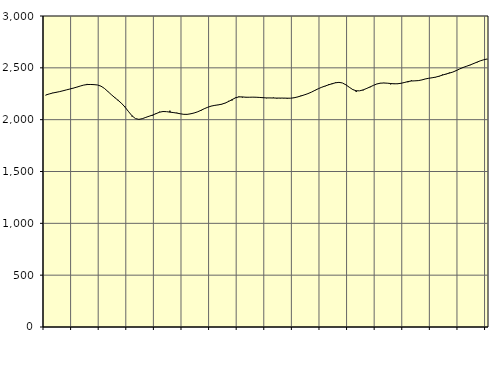
| Category | Piggar | Series 1 |
|---|---|---|
| nan | 2235.2 | 2238.07 |
| 87.0 | 2248 | 2247.77 |
| 87.0 | 2258.7 | 2256.79 |
| 87.0 | 2261.1 | 2263.73 |
| nan | 2269.2 | 2270.29 |
| 88.0 | 2278.3 | 2278.61 |
| 88.0 | 2286.8 | 2287.31 |
| 88.0 | 2295.1 | 2295.56 |
| nan | 2302.8 | 2304.44 |
| 89.0 | 2315.4 | 2313.88 |
| 89.0 | 2324.6 | 2324.27 |
| 89.0 | 2334.2 | 2333.53 |
| nan | 2344.9 | 2338.76 |
| 90.0 | 2336.5 | 2339.51 |
| 90.0 | 2337.7 | 2338.01 |
| 90.0 | 2334.8 | 2334.57 |
| nan | 2324.6 | 2323.56 |
| 91.0 | 2302.7 | 2301.9 |
| 91.0 | 2269.9 | 2272.43 |
| 91.0 | 2240.9 | 2241.71 |
| nan | 2208.5 | 2213.39 |
| 92.0 | 2190.7 | 2186.06 |
| 92.0 | 2154.6 | 2156.76 |
| 92.0 | 2125.3 | 2120.67 |
| nan | 2079.9 | 2078.05 |
| 93.0 | 2031 | 2037.69 |
| 93.0 | 2010.7 | 2010.76 |
| 93.0 | 2003.6 | 2002.97 |
| nan | 2011.4 | 2009.57 |
| 94.0 | 2024.1 | 2021.88 |
| 94.0 | 2034.2 | 2033.52 |
| 94.0 | 2039.3 | 2044.78 |
| nan | 2054.3 | 2058.54 |
| 95.0 | 2076.3 | 2071.97 |
| 95.0 | 2078.9 | 2078.75 |
| 95.0 | 2077.3 | 2077.29 |
| nan | 2086.9 | 2072.66 |
| 96.0 | 2065.4 | 2068.48 |
| 96.0 | 2067 | 2063.51 |
| 96.0 | 2057.8 | 2056.82 |
| nan | 2049.8 | 2051.5 |
| 97.0 | 2049.3 | 2051.26 |
| 97.0 | 2058.5 | 2056.44 |
| 97.0 | 2064.6 | 2064.35 |
| nan | 2074.3 | 2075.24 |
| 98.0 | 2085 | 2090.03 |
| 98.0 | 2108 | 2106.24 |
| 98.0 | 2119.9 | 2119.99 |
| nan | 2132.3 | 2130.99 |
| 99.0 | 2140.6 | 2137.99 |
| 99.0 | 2140.8 | 2142.72 |
| 99.0 | 2146.2 | 2149.23 |
| nan | 2158.8 | 2160.11 |
| 0.0 | 2181.5 | 2175.11 |
| 0.0 | 2184.5 | 2193.18 |
| 0.0 | 2213.5 | 2210.47 |
| nan | 2224 | 2219.69 |
| 1.0 | 2213.5 | 2219.41 |
| 1.0 | 2219 | 2216.24 |
| 1.0 | 2216.7 | 2216.34 |
| nan | 2218.3 | 2217.19 |
| 2.0 | 2217.2 | 2216.32 |
| 2.0 | 2212.2 | 2214.56 |
| 2.0 | 2214.5 | 2211.74 |
| nan | 2206.9 | 2209.84 |
| 3.0 | 2210.1 | 2209.61 |
| 3.0 | 2213 | 2208.93 |
| 3.0 | 2204.3 | 2208.23 |
| nan | 2205.4 | 2208.25 |
| 4.0 | 2205.4 | 2208.12 |
| 4.0 | 2202.5 | 2207.12 |
| 4.0 | 2206.9 | 2206.9 |
| nan | 2213.6 | 2211.21 |
| 5.0 | 2217.8 | 2219.19 |
| 5.0 | 2232.2 | 2228.64 |
| 5.0 | 2240.9 | 2239.33 |
| nan | 2252.1 | 2251.02 |
| 6.0 | 2265 | 2265.19 |
| 6.0 | 2278.8 | 2282.04 |
| 6.0 | 2298.2 | 2298.35 |
| nan | 2311 | 2312.62 |
| 7.0 | 2322.2 | 2324.66 |
| 7.0 | 2341.2 | 2335.86 |
| 7.0 | 2342.8 | 2346.71 |
| nan | 2359.7 | 2355.52 |
| 8.0 | 2357.1 | 2359.75 |
| 8.0 | 2354.1 | 2354.13 |
| 8.0 | 2339.2 | 2336.35 |
| nan | 2311.8 | 2312.71 |
| 9.0 | 2287.5 | 2290.52 |
| 9.0 | 2266.7 | 2278.63 |
| 9.0 | 2278.2 | 2278.28 |
| nan | 2282.3 | 2287.14 |
| 10.0 | 2305 | 2300.58 |
| 10.0 | 2312.3 | 2315.52 |
| 10.0 | 2330.4 | 2330.89 |
| nan | 2345.2 | 2344.21 |
| 11.0 | 2354 | 2352.03 |
| 11.0 | 2355.2 | 2353.64 |
| 11.0 | 2351.3 | 2352 |
| nan | 2340.1 | 2348.71 |
| 12.0 | 2349.4 | 2345.74 |
| 12.0 | 2343.6 | 2346.48 |
| 12.0 | 2352.7 | 2351.11 |
| nan | 2361.9 | 2358.81 |
| 13.0 | 2360.8 | 2367.5 |
| 13.0 | 2379.2 | 2372.88 |
| 13.0 | 2375.4 | 2374.61 |
| nan | 2375.1 | 2376.67 |
| 14.0 | 2381.9 | 2383.11 |
| 14.0 | 2392.9 | 2392.18 |
| 14.0 | 2398 | 2399.18 |
| nan | 2404.9 | 2404.1 |
| 15.0 | 2407.7 | 2410.15 |
| 15.0 | 2415.1 | 2419.11 |
| 15.0 | 2435.5 | 2429.69 |
| nan | 2436.5 | 2440.13 |
| 16.0 | 2454.3 | 2449.02 |
| 16.0 | 2458.3 | 2459.32 |
| 16.0 | 2469.6 | 2473.2 |
| nan | 2489.7 | 2489.29 |
| 17.0 | 2506.5 | 2503.61 |
| 17.0 | 2516.4 | 2515.41 |
| 17.0 | 2525.4 | 2527.37 |
| nan | 2546 | 2540.74 |
| 18.0 | 2550.1 | 2554.75 |
| 18.0 | 2566.9 | 2567.76 |
| 18.0 | 2578.5 | 2578.17 |
| nan | 2583.2 | 2585.42 |